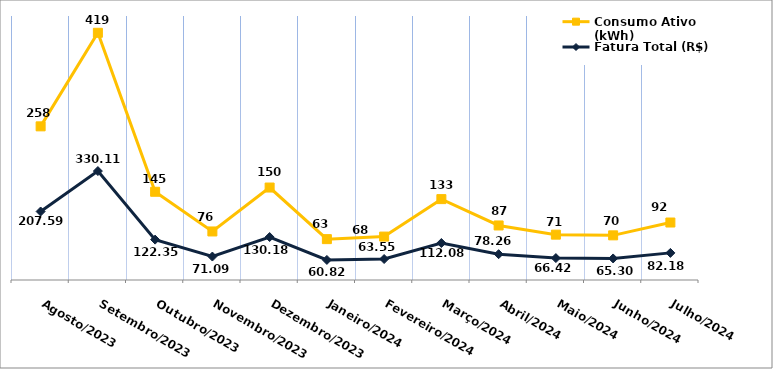
| Category | Fatura Total (R$) | Consumo Ativo (kWh) |
|---|---|---|
| Agosto/2023 | 207.59 | 258 |
| Setembro/2023 | 330.11 | 419 |
| Outubro/2023 | 122.35 | 145 |
| Novembro/2023 | 71.09 | 76 |
| Dezembro/2023 | 130.18 | 150 |
| Janeiro/2024 | 60.82 | 63 |
| Fevereiro/2024 | 63.55 | 68 |
| Março/2024 | 112.08 | 133 |
| Abril/2024 | 78.26 | 87 |
| Maio/2024 | 66.42 | 71 |
| Junho/2024 | 65.3 | 70 |
| Julho/2024 | 82.18 | 92 |